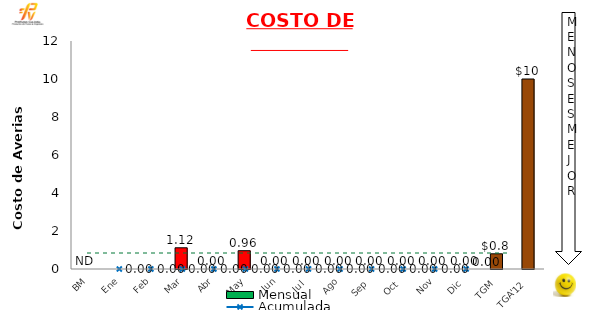
| Category | Mensual |
|---|---|
| BM | 0 |
| Ene | 0 |
| Feb | 0 |
| Mar | 1.116 |
| Abr | 0 |
| May | 0.963 |
| Jun | 0 |
| Jul | 0 |
| Ago | 0 |
| Sep | 0 |
| Oct | 0 |
| Nov | 0 |
| Dic | 0 |
| TGM | 0.8 |
| TGA'12 | 10 |